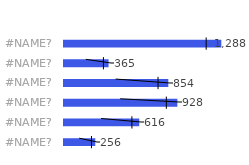
| Category | Продажи |
|---|---|
| Rubok | 256 |
| Babidas | 616 |
| Gunverse | 928 |
| Nuke | 854 |
| Asic | 365 |
| Galosha | 1288 |